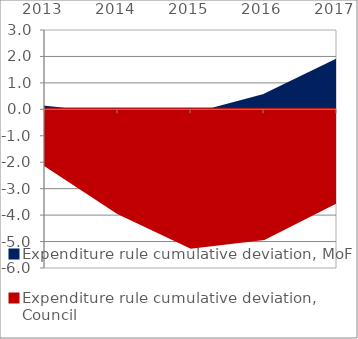
| Category | Expenditure rule cumulative deviation, MoF | Expenditure rule cumulative deviation, Council |
|---|---|---|
| 2013.0 | 0.081 | -2.099 |
| 2014.0 | -0.204 | -3.908 |
| 2015.0 | -0.216 | -5.213 |
| 2016.0 | 0.53 | -4.886 |
| 2017.0 | 1.867 | -3.49 |